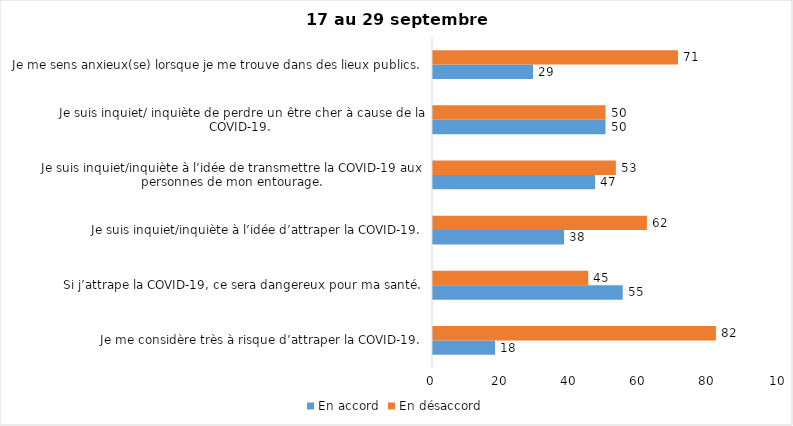
| Category | En accord | En désaccord |
|---|---|---|
| Je me considère très à risque d’attraper la COVID-19. | 18 | 82 |
| Si j’attrape la COVID-19, ce sera dangereux pour ma santé. | 55 | 45 |
| Je suis inquiet/inquiète à l’idée d’attraper la COVID-19. | 38 | 62 |
| Je suis inquiet/inquiète à l’idée de transmettre la COVID-19 aux personnes de mon entourage. | 47 | 53 |
| Je suis inquiet/ inquiète de perdre un être cher à cause de la COVID-19. | 50 | 50 |
| Je me sens anxieux(se) lorsque je me trouve dans des lieux publics. | 29 | 71 |